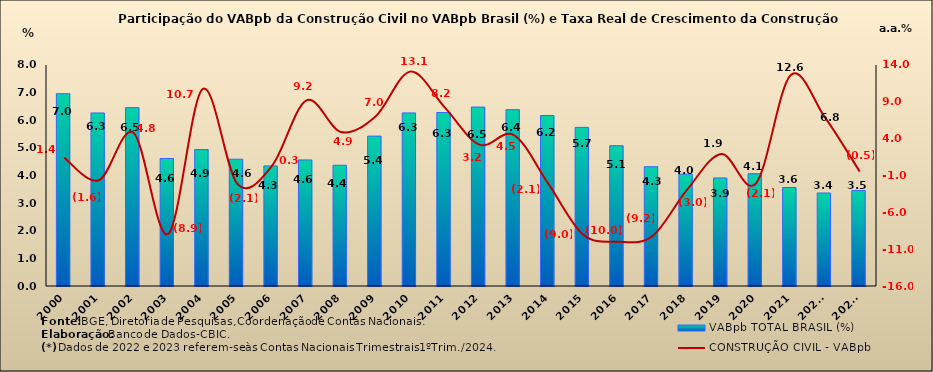
| Category | VABpb TOTAL BRASIL (%) |
|---|---|
| 2000 | 6.96 |
| 2001 | 6.264 |
| 2002 | 6.454 |
| 2003 | 4.615 |
| 2004 | 4.937 |
| 2005 | 4.589 |
| 2006 | 4.348 |
| 2007 | 4.564 |
| 2008 | 4.371 |
| 2009 | 5.426 |
| 2010 | 6.265 |
| 2011 | 6.277 |
| 2012 | 6.478 |
| 2013 | 6.382 |
| 2014 | 6.173 |
| 2015 | 5.742 |
| 2016 | 5.077 |
| 2017 | 4.316 |
| 2018 | 4.047 |
| 2019 | 3.912 |
| 2020 | 4.063 |
| 2021 | 3.566 |
| 2022* | 3.366 |
| 2023* | 3.456 |